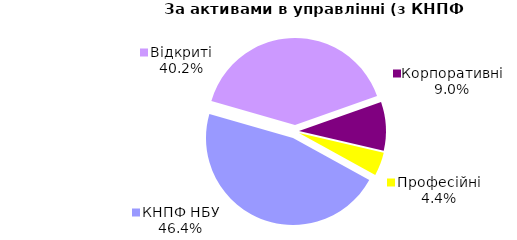
| Category | Series 0 |
|---|---|
| Відкриті | 1354.582 |
| Корпоративні | 304.857 |
| Професійні | 146.879 |
| КНПФ НБУ | 1566.712 |